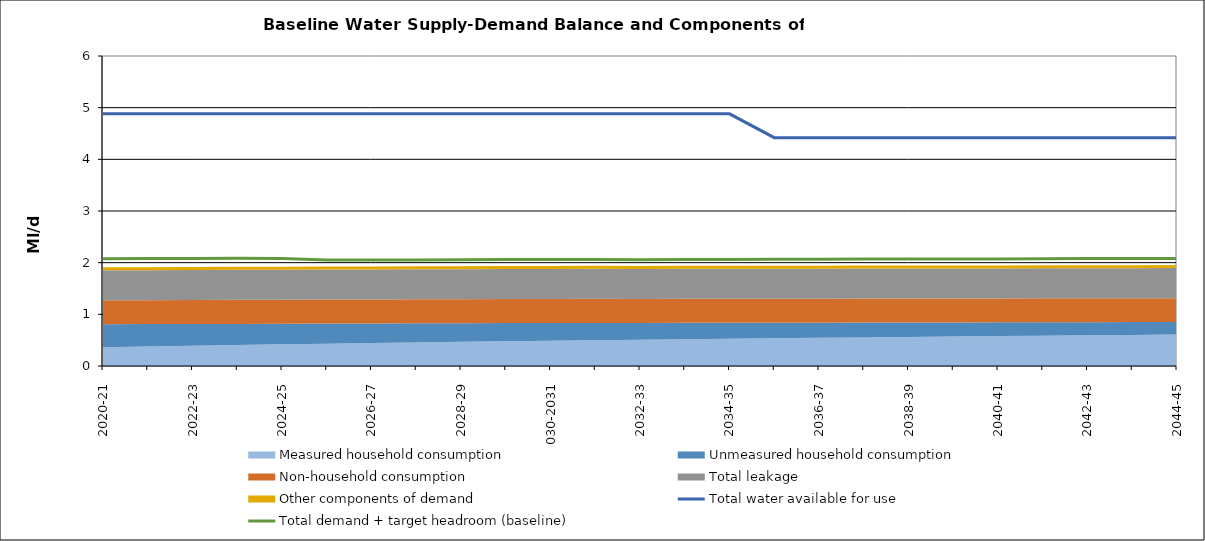
| Category | Total water available for use | Total demand + target headroom (baseline) |
|---|---|---|
| 0 | 4.88 | 2.077 |
| 1 | 4.88 | 2.082 |
| 2 | 4.88 | 2.082 |
| 3 | 4.88 | 2.083 |
| 4 | 4.88 | 2.081 |
| 5 | 4.88 | 2.052 |
| 6 | 4.88 | 2.052 |
| 7 | 4.88 | 2.053 |
| 8 | 4.88 | 2.055 |
| 9 | 4.88 | 2.061 |
| 10 | 4.88 | 2.061 |
| 11 | 4.88 | 2.059 |
| 12 | 4.88 | 2.058 |
| 13 | 4.88 | 2.06 |
| 14 | 4.88 | 2.063 |
| 15 | 4.42 | 2.064 |
| 16 | 4.42 | 2.067 |
| 17 | 4.42 | 2.069 |
| 18 | 4.42 | 2.072 |
| 19 | 4.42 | 2.07 |
| 20 | 4.42 | 2.073 |
| 21 | 4.42 | 2.077 |
| 22 | 4.42 | 2.078 |
| 23 | 4.42 | 2.079 |
| 24 | 4.42 | 2.08 |